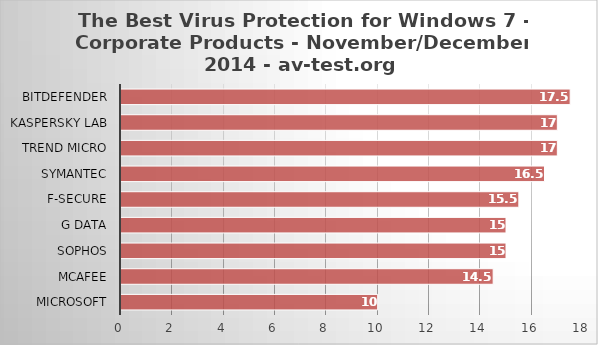
| Category | Series 0 |
|---|---|
| Microsoft | 10 |
| McAfee | 14.5 |
| Sophos | 15 |
| G Data | 15 |
| F-Secure | 15.5 |
| Symantec | 16.5 |
| Trend Micro | 17 |
| Kaspersky Lab | 17 |
| Bitdefender | 17.5 |